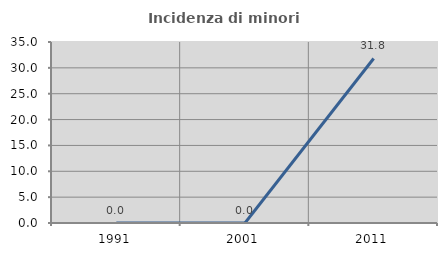
| Category | Incidenza di minori stranieri |
|---|---|
| 1991.0 | 0 |
| 2001.0 | 0 |
| 2011.0 | 31.818 |